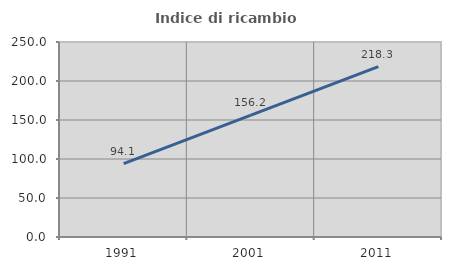
| Category | Indice di ricambio occupazionale  |
|---|---|
| 1991.0 | 94.079 |
| 2001.0 | 156.204 |
| 2011.0 | 218.321 |